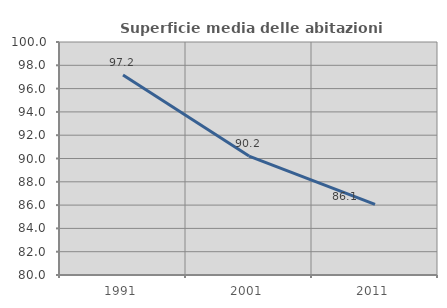
| Category | Superficie media delle abitazioni occupate |
|---|---|
| 1991.0 | 97.166 |
| 2001.0 | 90.21 |
| 2011.0 | 86.062 |